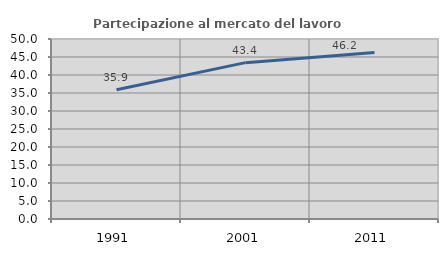
| Category | Partecipazione al mercato del lavoro  femminile |
|---|---|
| 1991.0 | 35.895 |
| 2001.0 | 43.432 |
| 2011.0 | 46.221 |